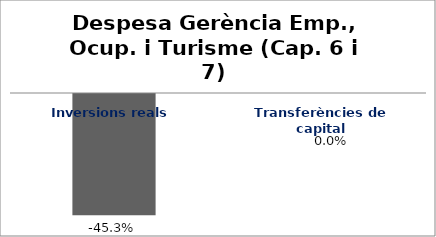
| Category | Series 0 |
|---|---|
| Inversions reals | -0.453 |
| Transferències de capital | 0 |